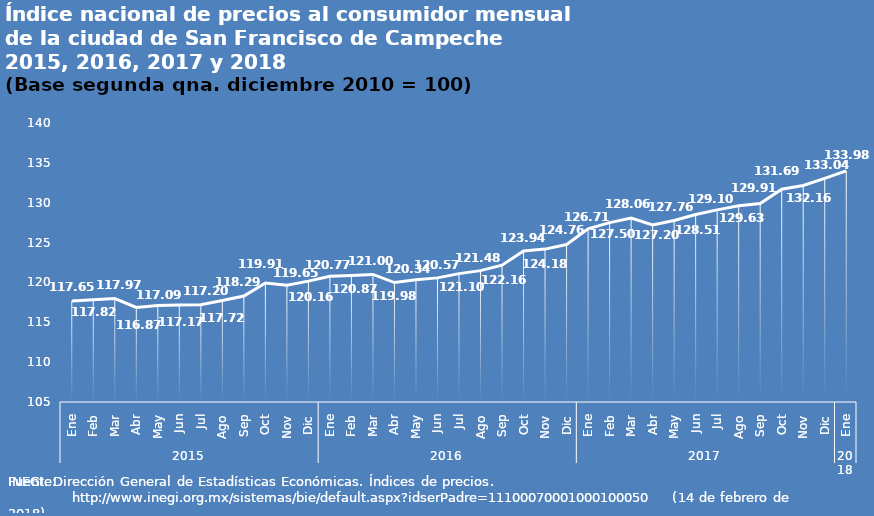
| Category | INPC |
|---|---|
| 0 | 117.658 |
| 1 | 117.827 |
| 2 | 117.971 |
| 3 | 116.87 |
| 4 | 117.095 |
| 5 | 117.179 |
| 6 | 117.205 |
| 7 | 117.729 |
| 8 | 118.294 |
| 9 | 119.918 |
| 10 | 119.657 |
| 11 | 120.163 |
| 12 | 120.775 |
| 13 | 120.871 |
| 14 | 121 |
| 15 | 119.98 |
| 16 | 120.34 |
| 17 | 120.57 |
| 18 | 121.105 |
| 19 | 121.481 |
| 20 | 122.165 |
| 21 | 123.942 |
| 22 | 124.18 |
| 23 | 124.76 |
| 24 | 126.716 |
| 25 | 127.506 |
| 26 | 128.063 |
| 27 | 127.206 |
| 28 | 127.766 |
| 29 | 128.514 |
| 30 | 129.102 |
| 31 | 129.63 |
| 32 | 129.911 |
| 33 | 131.696 |
| 34 | 132.166 |
| 35 | 133.047 |
| 36 | 133.988 |